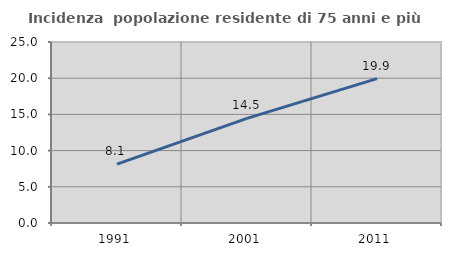
| Category | Incidenza  popolazione residente di 75 anni e più |
|---|---|
| 1991.0 | 8.143 |
| 2001.0 | 14.453 |
| 2011.0 | 19.932 |